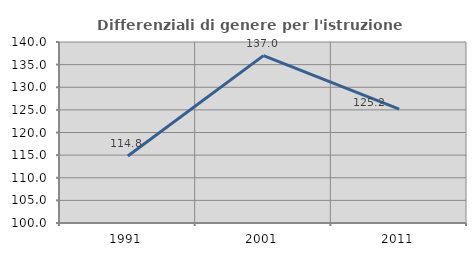
| Category | Differenziali di genere per l'istruzione superiore |
|---|---|
| 1991.0 | 114.791 |
| 2001.0 | 136.988 |
| 2011.0 | 125.17 |